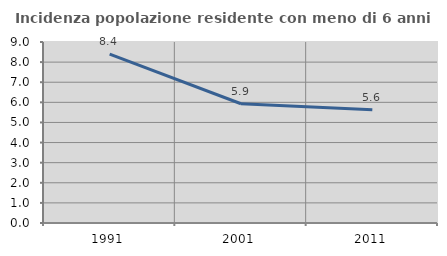
| Category | Incidenza popolazione residente con meno di 6 anni |
|---|---|
| 1991.0 | 8.397 |
| 2001.0 | 5.929 |
| 2011.0 | 5.634 |